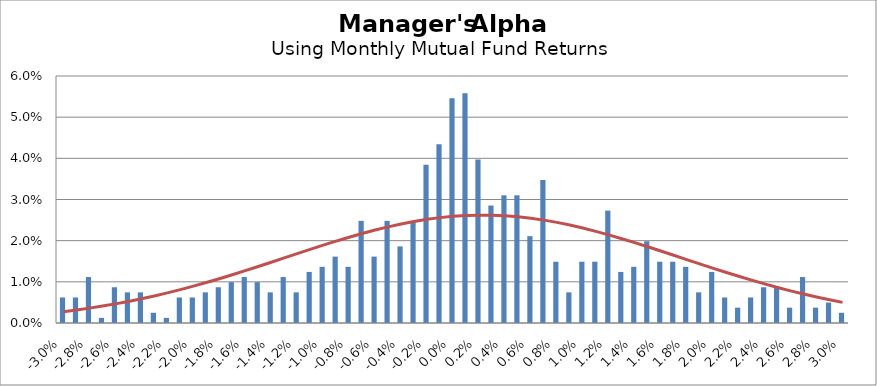
| Category | Series 0 |
|---|---|
| -0.03 | 0.006 |
| -0.029 | 0.006 |
| -0.028 | 0.011 |
| -0.027 | 0.001 |
| -0.026 | 0.009 |
| -0.025 | 0.007 |
| -0.024 | 0.007 |
| -0.023 | 0.002 |
| -0.022 | 0.001 |
| -0.021 | 0.006 |
| -0.02 | 0.006 |
| -0.019 | 0.007 |
| -0.018 | 0.009 |
| -0.017 | 0.01 |
| -0.016 | 0.011 |
| -0.015 | 0.01 |
| -0.014 | 0.007 |
| -0.013 | 0.011 |
| -0.012 | 0.007 |
| -0.011 | 0.012 |
| -0.01 | 0.014 |
| -0.009 | 0.016 |
| -0.008 | 0.014 |
| -0.007 | 0.025 |
| -0.006 | 0.016 |
| -0.005 | 0.025 |
| -0.004 | 0.019 |
| -0.003 | 0.025 |
| -0.002 | 0.038 |
| -0.001 | 0.043 |
| 0.0 | 0.055 |
| 0.001 | 0.056 |
| 0.002 | 0.04 |
| 0.003 | 0.029 |
| 0.004 | 0.031 |
| 0.005 | 0.031 |
| 0.006 | 0.021 |
| 0.007 | 0.035 |
| 0.008 | 0.015 |
| 0.009 | 0.007 |
| 0.01 | 0.015 |
| 0.011 | 0.015 |
| 0.012 | 0.027 |
| 0.013 | 0.012 |
| 0.014 | 0.014 |
| 0.015 | 0.02 |
| 0.016 | 0.015 |
| 0.017 | 0.015 |
| 0.018 | 0.014 |
| 0.019 | 0.007 |
| 0.02 | 0.012 |
| 0.021 | 0.006 |
| 0.022 | 0.004 |
| 0.023 | 0.006 |
| 0.024 | 0.009 |
| 0.025 | 0.009 |
| 0.026 | 0.004 |
| 0.027 | 0.011 |
| 0.028 | 0.004 |
| 0.029 | 0.005 |
| 0.03 | 0.002 |